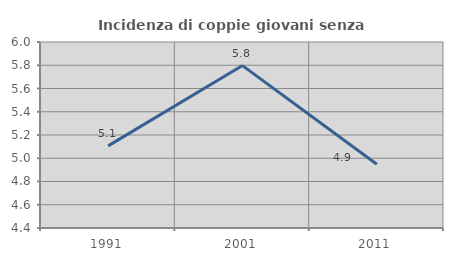
| Category | Incidenza di coppie giovani senza figli |
|---|---|
| 1991.0 | 5.106 |
| 2001.0 | 5.797 |
| 2011.0 | 4.949 |